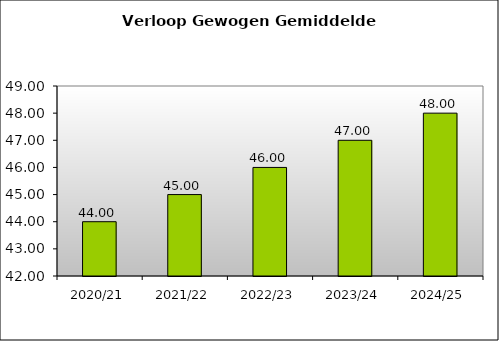
| Category | Series 0 |
|---|---|
| 2020/21 | 44 |
| 2021/22 | 45 |
| 2022/23 | 46 |
| 2023/24 | 47 |
| 2024/25 | 48 |